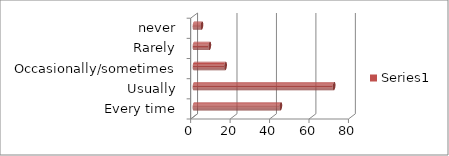
| Category | Series 0 |
|---|---|
| Every time | 44 |
| Usually | 71 |
| Occasionally/sometimes | 16 |
| Rarely | 8 |
| never | 4 |